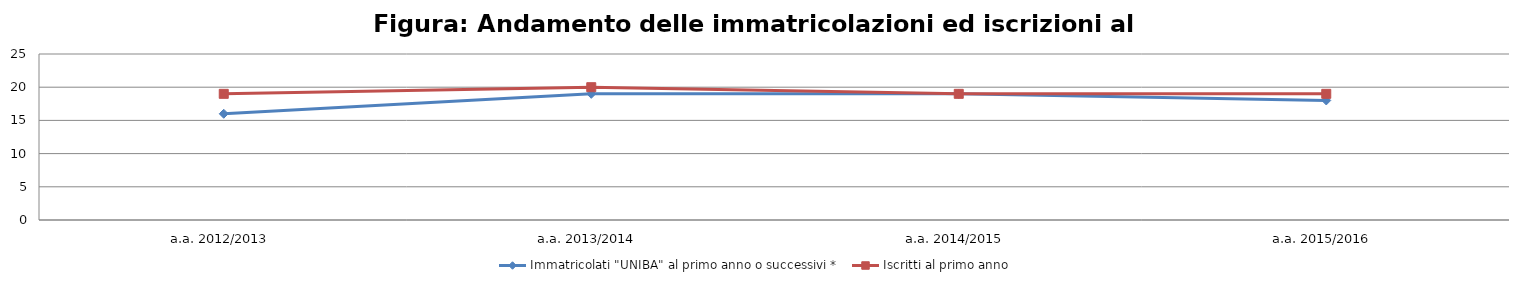
| Category | Immatricolati "UNIBA" al primo anno o successivi * | Iscritti al primo anno  |
|---|---|---|
| a.a. 2012/2013 | 16 | 19 |
| a.a. 2013/2014 | 19 | 20 |
| a.a. 2014/2015 | 19 | 19 |
| a.a. 2015/2016 | 18 | 19 |